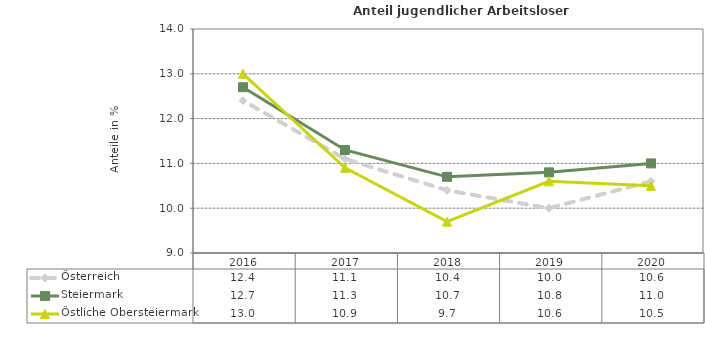
| Category | Österreich | Steiermark | Östliche Obersteiermark |
|---|---|---|---|
| 2020.0 | 10.6 | 11 | 10.5 |
| 2019.0 | 10 | 10.8 | 10.6 |
| 2018.0 | 10.4 | 10.7 | 9.7 |
| 2017.0 | 11.1 | 11.3 | 10.9 |
| 2016.0 | 12.4 | 12.7 | 13 |